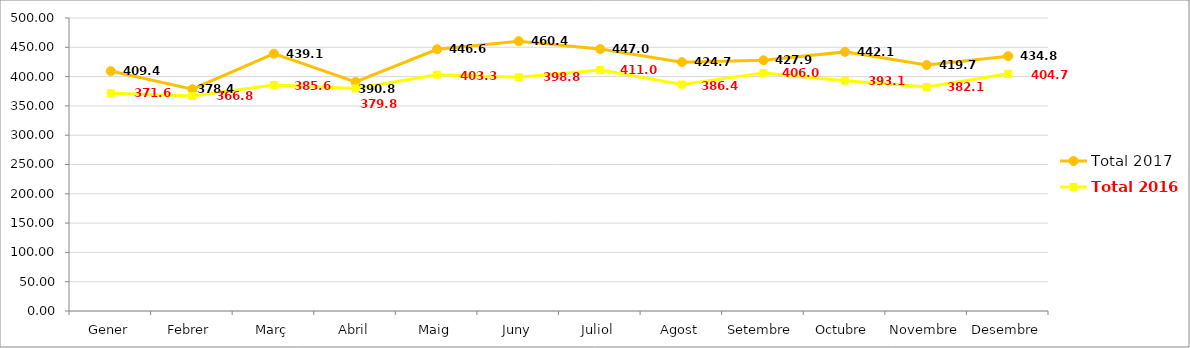
| Category | Total 2017 | Total 2016 |
|---|---|---|
| Gener | 409.42 | 371.62 |
| Febrer | 378.48 | 366.84 |
| Març | 439.16 | 385.68 |
| Abril | 390.82 | 379.84 |
| Maig | 446.66 | 403.32 |
| Juny | 460.46 | 398.86 |
| Juliol | 447 | 411.04 |
| Agost | 424.7 | 386.4 |
| Setembre | 427.9 | 406 |
| Octubre | 442.179 | 393.1 |
| Novembre | 419.76 | 382.181 |
| Desembre | 434.88 | 404.76 |